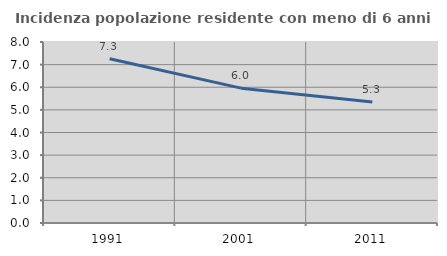
| Category | Incidenza popolazione residente con meno di 6 anni |
|---|---|
| 1991.0 | 7.257 |
| 2001.0 | 5.96 |
| 2011.0 | 5.348 |